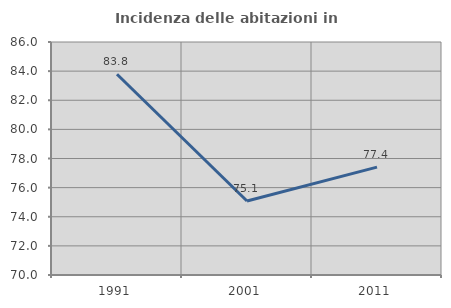
| Category | Incidenza delle abitazioni in proprietà  |
|---|---|
| 1991.0 | 83.784 |
| 2001.0 | 75.082 |
| 2011.0 | 77.409 |